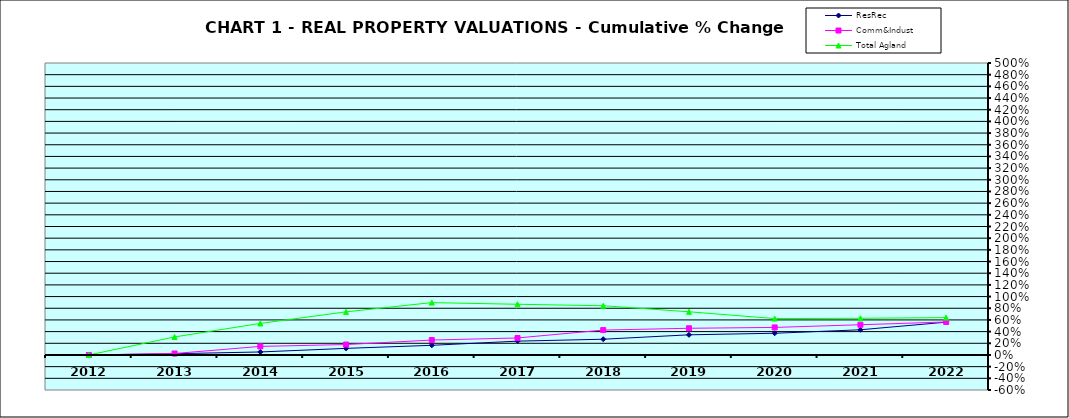
| Category | ResRec | Comm&Indust | Total Agland |
|---|---|---|---|
| 2012.0 | 0 | 0 | 0 |
| 2013.0 | 0.021 | 0.025 | 0.309 |
| 2014.0 | 0.051 | 0.147 | 0.541 |
| 2015.0 | 0.113 | 0.179 | 0.738 |
| 2016.0 | 0.165 | 0.255 | 0.896 |
| 2017.0 | 0.237 | 0.291 | 0.868 |
| 2018.0 | 0.27 | 0.426 | 0.843 |
| 2019.0 | 0.345 | 0.457 | 0.74 |
| 2020.0 | 0.372 | 0.472 | 0.623 |
| 2021.0 | 0.431 | 0.518 | 0.628 |
| 2022.0 | 0.562 | 0.565 | 0.64 |